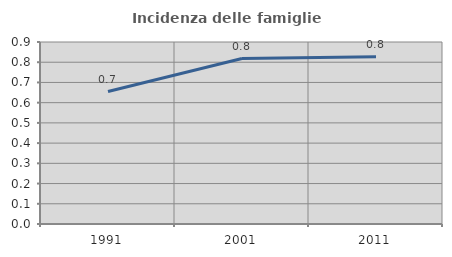
| Category | Incidenza delle famiglie numerose |
|---|---|
| 1991.0 | 0.655 |
| 2001.0 | 0.818 |
| 2011.0 | 0.826 |